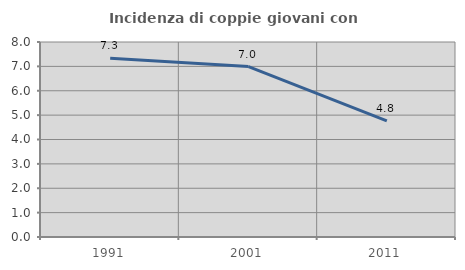
| Category | Incidenza di coppie giovani con figli |
|---|---|
| 1991.0 | 7.333 |
| 2001.0 | 6.993 |
| 2011.0 | 4.762 |